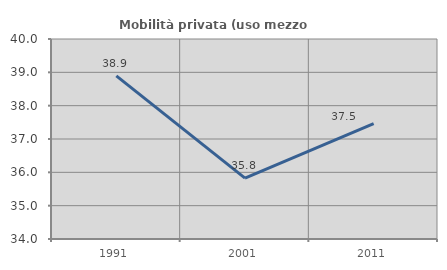
| Category | Mobilità privata (uso mezzo privato) |
|---|---|
| 1991.0 | 38.892 |
| 2001.0 | 35.826 |
| 2011.0 | 37.465 |